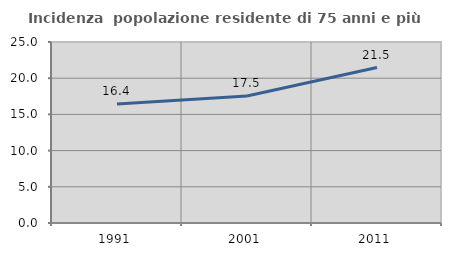
| Category | Incidenza  popolazione residente di 75 anni e più |
|---|---|
| 1991.0 | 16.425 |
| 2001.0 | 17.544 |
| 2011.0 | 21.477 |